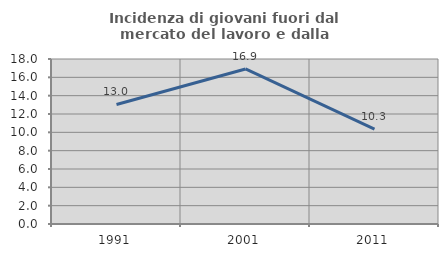
| Category | Incidenza di giovani fuori dal mercato del lavoro e dalla formazione  |
|---|---|
| 1991.0 | 13.043 |
| 2001.0 | 16.912 |
| 2011.0 | 10.345 |